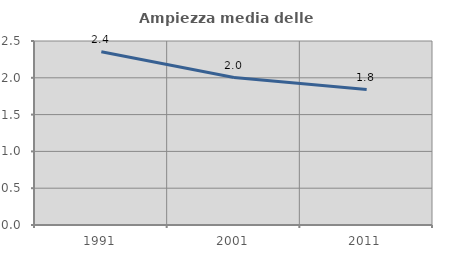
| Category | Ampiezza media delle famiglie |
|---|---|
| 1991.0 | 2.354 |
| 2001.0 | 2.003 |
| 2011.0 | 1.84 |